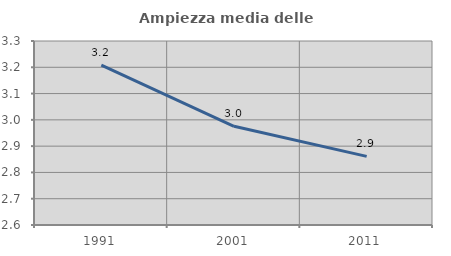
| Category | Ampiezza media delle famiglie |
|---|---|
| 1991.0 | 3.208 |
| 2001.0 | 2.976 |
| 2011.0 | 2.861 |